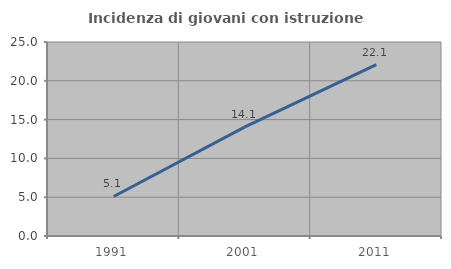
| Category | Incidenza di giovani con istruzione universitaria |
|---|---|
| 1991.0 | 5.096 |
| 2001.0 | 14.054 |
| 2011.0 | 22.078 |